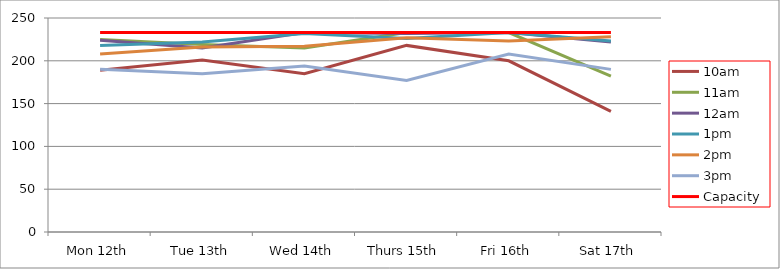
| Category | 9am | 10am | 11am | 12am | 1pm | 2pm | 3pm | 4pm | 5pm | Capacity |
|---|---|---|---|---|---|---|---|---|---|---|
| Mon 12th |  | 189 | 225 | 224 | 218 | 208 | 190 |  |  | 233 |
| Tue 13th |  | 201 | 219 | 215 | 222 | 216 | 185 |  |  | 233 |
| Wed 14th |  | 185 | 215 | 233 | 232 | 217 | 194 |  |  | 233 |
| Thurs 15th |  | 218 | 233 | 232 | 226 | 227 | 177 |  |  | 233 |
| Fri 16th |  | 200 | 233 | 233 | 233 | 223 | 208 |  |  | 233 |
| Sat 17th |  | 141 | 182 | 222 | 223 | 228 | 190 |  |  | 233 |